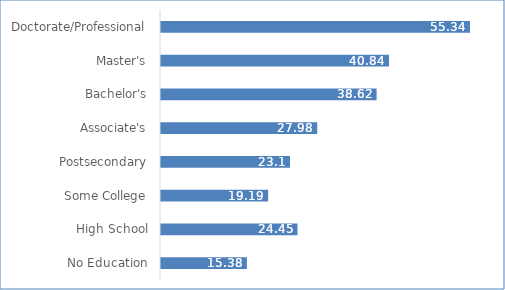
| Category | Series 0 |
|---|---|
| No Education | 15.38 |
| High School | 24.45 |
| Some College | 19.19 |
| Postsecondary | 23.1 |
| Associate's | 27.98 |
| Bachelor's | 38.62 |
| Master's | 40.84 |
| Doctorate/Professional | 55.34 |